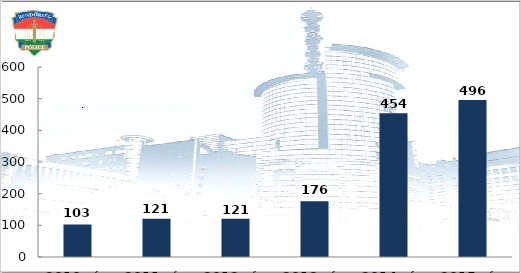
| Category | Végrehajtott elővezetések száma |
|---|---|
| 2010. év | 103 |
| 2011. év | 121 |
| 2012. év | 121 |
| 2013. év | 176 |
| 2014. év | 454 |
| 2015. év | 496 |